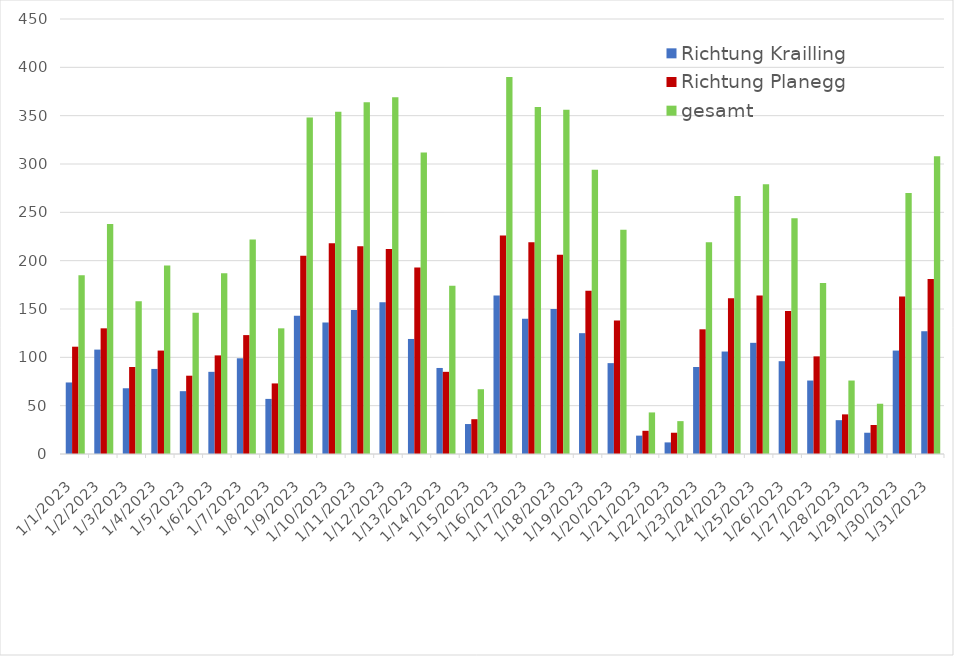
| Category | Richtung Krailling | Richtung Planegg | gesamt |
|---|---|---|---|
| 1/1/23 | 74 | 111 | 185 |
| 1/2/23 | 108 | 130 | 238 |
| 1/3/23 | 68 | 90 | 158 |
| 1/4/23 | 88 | 107 | 195 |
| 1/5/23 | 65 | 81 | 146 |
| 1/6/23 | 85 | 102 | 187 |
| 1/7/23 | 99 | 123 | 222 |
| 1/8/23 | 57 | 73 | 130 |
| 1/9/23 | 143 | 205 | 348 |
| 1/10/23 | 136 | 218 | 354 |
| 1/11/23 | 149 | 215 | 364 |
| 1/12/23 | 157 | 212 | 369 |
| 1/13/23 | 119 | 193 | 312 |
| 1/14/23 | 89 | 85 | 174 |
| 1/15/23 | 31 | 36 | 67 |
| 1/16/23 | 164 | 226 | 390 |
| 1/17/23 | 140 | 219 | 359 |
| 1/18/23 | 150 | 206 | 356 |
| 1/19/23 | 125 | 169 | 294 |
| 1/20/23 | 94 | 138 | 232 |
| 1/21/23 | 19 | 24 | 43 |
| 1/22/23 | 12 | 22 | 34 |
| 1/23/23 | 90 | 129 | 219 |
| 1/24/23 | 106 | 161 | 267 |
| 1/25/23 | 115 | 164 | 279 |
| 1/26/23 | 96 | 148 | 244 |
| 1/27/23 | 76 | 101 | 177 |
| 1/28/23 | 35 | 41 | 76 |
| 1/29/23 | 22 | 30 | 52 |
| 1/30/23 | 107 | 163 | 270 |
| 1/31/23 | 127 | 181 | 308 |